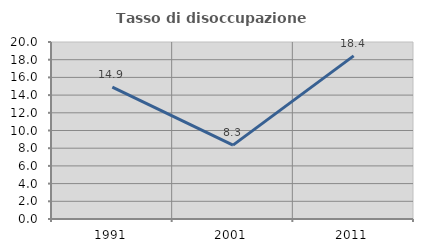
| Category | Tasso di disoccupazione giovanile  |
|---|---|
| 1991.0 | 14.902 |
| 2001.0 | 8.346 |
| 2011.0 | 18.43 |